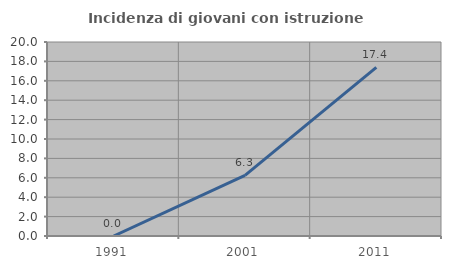
| Category | Incidenza di giovani con istruzione universitaria |
|---|---|
| 1991.0 | 0 |
| 2001.0 | 6.25 |
| 2011.0 | 17.391 |